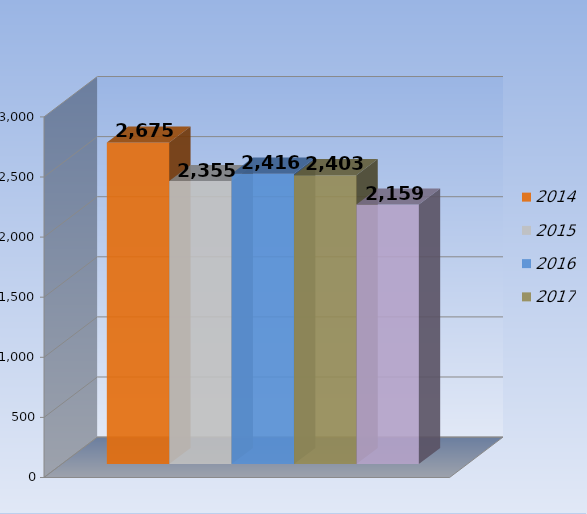
| Category | 2014 | 2015 | 2016 | 2017 | 2018 |
|---|---|---|---|---|---|
| 0 | 2675 | 2355 | 2416 | 2403 | 2159 |